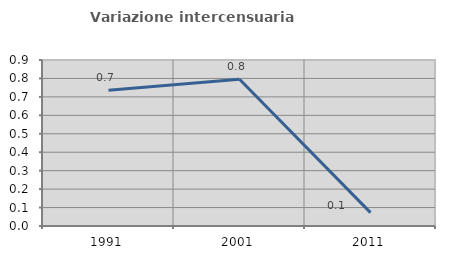
| Category | Variazione intercensuaria annua |
|---|---|
| 1991.0 | 0.736 |
| 2001.0 | 0.796 |
| 2011.0 | 0.072 |